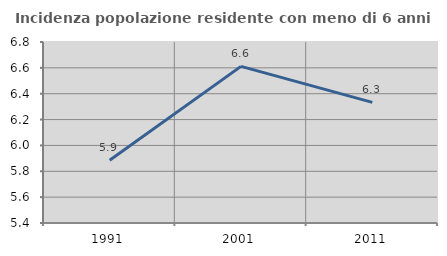
| Category | Incidenza popolazione residente con meno di 6 anni |
|---|---|
| 1991.0 | 5.885 |
| 2001.0 | 6.611 |
| 2011.0 | 6.333 |